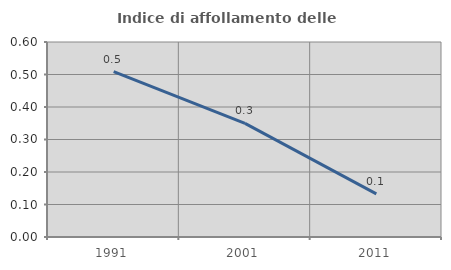
| Category | Indice di affollamento delle abitazioni  |
|---|---|
| 1991.0 | 0.509 |
| 2001.0 | 0.349 |
| 2011.0 | 0.133 |